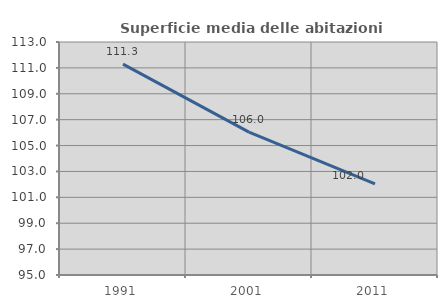
| Category | Superficie media delle abitazioni occupate |
|---|---|
| 1991.0 | 111.295 |
| 2001.0 | 106.038 |
| 2011.0 | 102.04 |